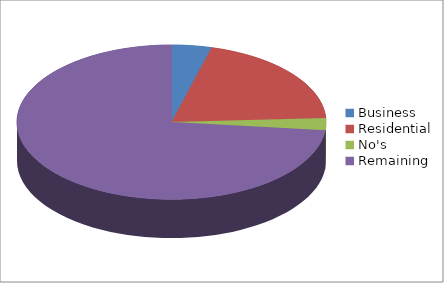
| Category | Series 0 |
|---|---|
| Business | 5 |
| Residential | 24 |
| No's | 3 |
| Remaining  | 88 |